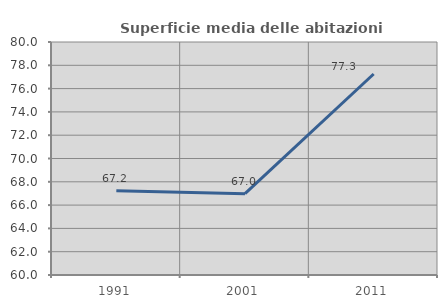
| Category | Superficie media delle abitazioni occupate |
|---|---|
| 1991.0 | 67.234 |
| 2001.0 | 66.983 |
| 2011.0 | 77.252 |